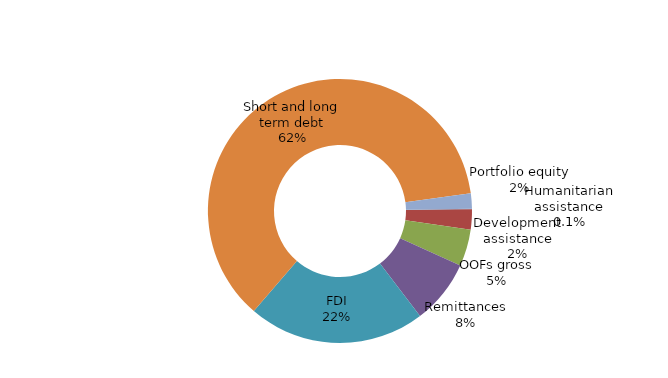
| Category | Series 0 |
|---|---|
| Humanitarian assistance | 0.051 |
| Development assistance | 2.272 |
| OOFs gross | 4.121 |
| Remittances | 7.212 |
| FDI | 19.853 |
| Short and long term debt | 56.355 |
| Portfolio equity | 1.698 |
| Peacekeeping | 0 |